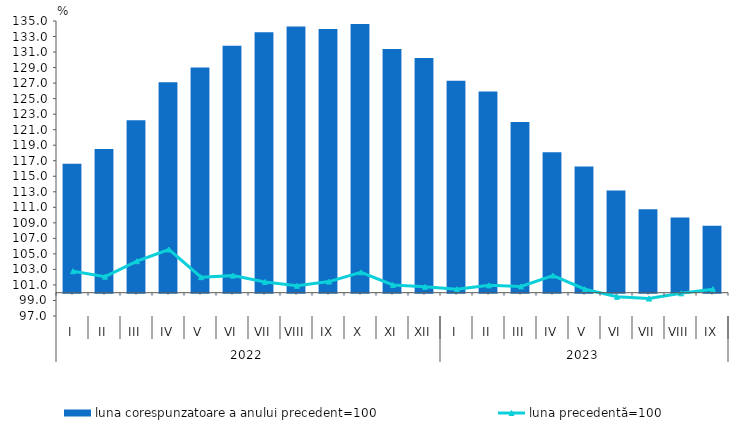
| Category | luna corespunzatoare a anului precedent=100 |
|---|---|
| 0 | 116.6 |
| 1 | 118.5 |
| 2 | 122.2 |
| 3 | 127.1 |
| 4 | 129 |
| 5 | 131.8 |
| 6 | 133.55 |
| 7 | 134.29 |
| 8 | 133.97 |
| 9 | 134.62 |
| 10 | 131.4 |
| 11 | 130.24 |
| 12 | 127.307 |
| 13 | 125.905 |
| 14 | 121.977 |
| 15 | 118.102 |
| 16 | 116.262 |
| 17 | 113.152 |
| 18 | 110.755 |
| 19 | 109.689 |
| 20 | 108.634 |